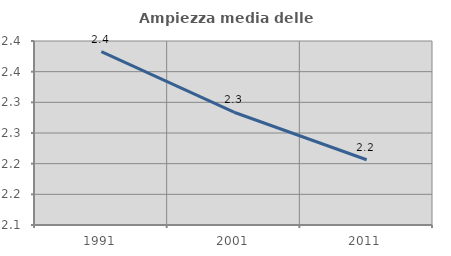
| Category | Ampiezza media delle famiglie |
|---|---|
| 1991.0 | 2.383 |
| 2001.0 | 2.284 |
| 2011.0 | 2.206 |